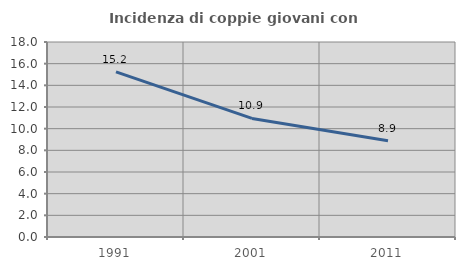
| Category | Incidenza di coppie giovani con figli |
|---|---|
| 1991.0 | 15.24 |
| 2001.0 | 10.944 |
| 2011.0 | 8.883 |